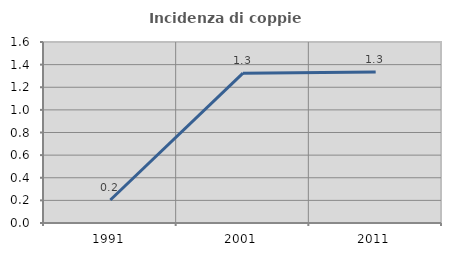
| Category | Incidenza di coppie miste |
|---|---|
| 1991.0 | 0.203 |
| 2001.0 | 1.324 |
| 2011.0 | 1.334 |